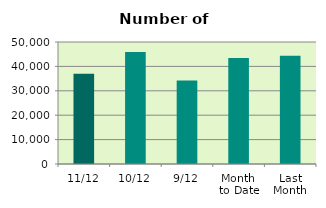
| Category | Series 0 |
|---|---|
| 11/12 | 37038 |
| 10/12 | 45868 |
| 9/12 | 34172 |
| Month 
to Date | 43432.5 |
| Last
Month | 44331.238 |